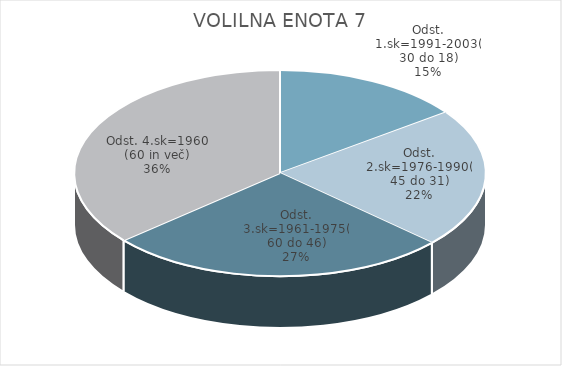
| Category | VOLILNA ENOTA 7 |
|---|---|
| Odst. 1.sk=1991-2003(30 do 18) | 6.37 |
| Odst. 2.sk=1976-1990(45 do 31) | 9.32 |
| Odst. 3.sk=1961-1975(60 do 46) | 11.46 |
| Odst. 4.sk=1960 (60 in več) | 15.47 |